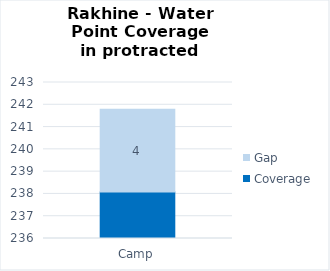
| Category | Coverage | Gap |
|---|---|---|
| Camp | 238.082 | 3.716 |